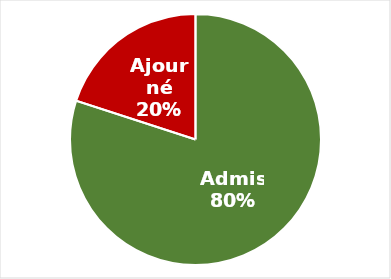
| Category | Series 0 |
|---|---|
| Admis | 24 |
| Ajourné | 6 |